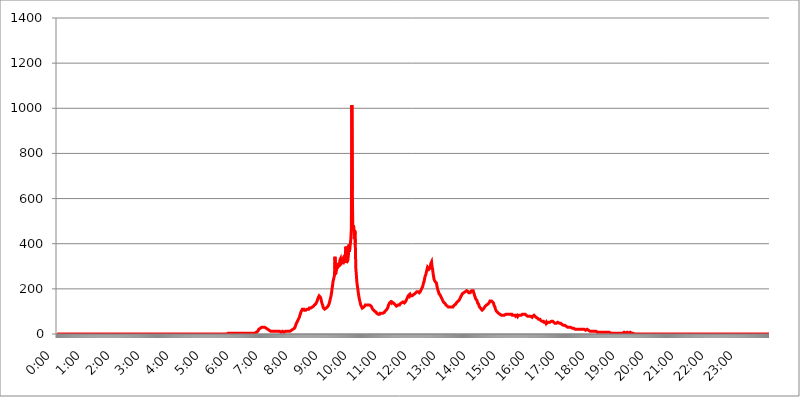
| Category | 2016.05.10. Intenzitás [W/m^2] |
|---|---|
| 0.0 | 0 |
| 0.0006944444444444445 | 0 |
| 0.001388888888888889 | 0 |
| 0.0020833333333333333 | 0 |
| 0.002777777777777778 | 0 |
| 0.003472222222222222 | 0 |
| 0.004166666666666667 | 0 |
| 0.004861111111111111 | 0 |
| 0.005555555555555556 | 0 |
| 0.0062499999999999995 | 0 |
| 0.006944444444444444 | 0 |
| 0.007638888888888889 | 0 |
| 0.008333333333333333 | 0 |
| 0.009027777777777779 | 0 |
| 0.009722222222222222 | 0 |
| 0.010416666666666666 | 0 |
| 0.011111111111111112 | 0 |
| 0.011805555555555555 | 0 |
| 0.012499999999999999 | 0 |
| 0.013194444444444444 | 0 |
| 0.013888888888888888 | 0 |
| 0.014583333333333332 | 0 |
| 0.015277777777777777 | 0 |
| 0.015972222222222224 | 0 |
| 0.016666666666666666 | 0 |
| 0.017361111111111112 | 0 |
| 0.018055555555555557 | 0 |
| 0.01875 | 0 |
| 0.019444444444444445 | 0 |
| 0.02013888888888889 | 0 |
| 0.020833333333333332 | 0 |
| 0.02152777777777778 | 0 |
| 0.022222222222222223 | 0 |
| 0.02291666666666667 | 0 |
| 0.02361111111111111 | 0 |
| 0.024305555555555556 | 0 |
| 0.024999999999999998 | 0 |
| 0.025694444444444447 | 0 |
| 0.02638888888888889 | 0 |
| 0.027083333333333334 | 0 |
| 0.027777777777777776 | 0 |
| 0.02847222222222222 | 0 |
| 0.029166666666666664 | 0 |
| 0.029861111111111113 | 0 |
| 0.030555555555555555 | 0 |
| 0.03125 | 0 |
| 0.03194444444444445 | 0 |
| 0.03263888888888889 | 0 |
| 0.03333333333333333 | 0 |
| 0.034027777777777775 | 0 |
| 0.034722222222222224 | 0 |
| 0.035416666666666666 | 0 |
| 0.036111111111111115 | 0 |
| 0.03680555555555556 | 0 |
| 0.0375 | 0 |
| 0.03819444444444444 | 0 |
| 0.03888888888888889 | 0 |
| 0.03958333333333333 | 0 |
| 0.04027777777777778 | 0 |
| 0.04097222222222222 | 0 |
| 0.041666666666666664 | 0 |
| 0.042361111111111106 | 0 |
| 0.04305555555555556 | 0 |
| 0.043750000000000004 | 0 |
| 0.044444444444444446 | 0 |
| 0.04513888888888889 | 0 |
| 0.04583333333333334 | 0 |
| 0.04652777777777778 | 0 |
| 0.04722222222222222 | 0 |
| 0.04791666666666666 | 0 |
| 0.04861111111111111 | 0 |
| 0.049305555555555554 | 0 |
| 0.049999999999999996 | 0 |
| 0.05069444444444445 | 0 |
| 0.051388888888888894 | 0 |
| 0.052083333333333336 | 0 |
| 0.05277777777777778 | 0 |
| 0.05347222222222222 | 0 |
| 0.05416666666666667 | 0 |
| 0.05486111111111111 | 0 |
| 0.05555555555555555 | 0 |
| 0.05625 | 0 |
| 0.05694444444444444 | 0 |
| 0.057638888888888885 | 0 |
| 0.05833333333333333 | 0 |
| 0.05902777777777778 | 0 |
| 0.059722222222222225 | 0 |
| 0.06041666666666667 | 0 |
| 0.061111111111111116 | 0 |
| 0.06180555555555556 | 0 |
| 0.0625 | 0 |
| 0.06319444444444444 | 0 |
| 0.06388888888888888 | 0 |
| 0.06458333333333334 | 0 |
| 0.06527777777777778 | 0 |
| 0.06597222222222222 | 0 |
| 0.06666666666666667 | 0 |
| 0.06736111111111111 | 0 |
| 0.06805555555555555 | 0 |
| 0.06874999999999999 | 0 |
| 0.06944444444444443 | 0 |
| 0.07013888888888889 | 0 |
| 0.07083333333333333 | 0 |
| 0.07152777777777779 | 0 |
| 0.07222222222222223 | 0 |
| 0.07291666666666667 | 0 |
| 0.07361111111111111 | 0 |
| 0.07430555555555556 | 0 |
| 0.075 | 0 |
| 0.07569444444444444 | 0 |
| 0.0763888888888889 | 0 |
| 0.07708333333333334 | 0 |
| 0.07777777777777778 | 0 |
| 0.07847222222222222 | 0 |
| 0.07916666666666666 | 0 |
| 0.0798611111111111 | 0 |
| 0.08055555555555556 | 0 |
| 0.08125 | 0 |
| 0.08194444444444444 | 0 |
| 0.08263888888888889 | 0 |
| 0.08333333333333333 | 0 |
| 0.08402777777777777 | 0 |
| 0.08472222222222221 | 0 |
| 0.08541666666666665 | 0 |
| 0.08611111111111112 | 0 |
| 0.08680555555555557 | 0 |
| 0.08750000000000001 | 0 |
| 0.08819444444444445 | 0 |
| 0.08888888888888889 | 0 |
| 0.08958333333333333 | 0 |
| 0.09027777777777778 | 0 |
| 0.09097222222222222 | 0 |
| 0.09166666666666667 | 0 |
| 0.09236111111111112 | 0 |
| 0.09305555555555556 | 0 |
| 0.09375 | 0 |
| 0.09444444444444444 | 0 |
| 0.09513888888888888 | 0 |
| 0.09583333333333333 | 0 |
| 0.09652777777777777 | 0 |
| 0.09722222222222222 | 0 |
| 0.09791666666666667 | 0 |
| 0.09861111111111111 | 0 |
| 0.09930555555555555 | 0 |
| 0.09999999999999999 | 0 |
| 0.10069444444444443 | 0 |
| 0.1013888888888889 | 0 |
| 0.10208333333333335 | 0 |
| 0.10277777777777779 | 0 |
| 0.10347222222222223 | 0 |
| 0.10416666666666667 | 0 |
| 0.10486111111111111 | 0 |
| 0.10555555555555556 | 0 |
| 0.10625 | 0 |
| 0.10694444444444444 | 0 |
| 0.1076388888888889 | 0 |
| 0.10833333333333334 | 0 |
| 0.10902777777777778 | 0 |
| 0.10972222222222222 | 0 |
| 0.1111111111111111 | 0 |
| 0.11180555555555556 | 0 |
| 0.11180555555555556 | 0 |
| 0.1125 | 0 |
| 0.11319444444444444 | 0 |
| 0.11388888888888889 | 0 |
| 0.11458333333333333 | 0 |
| 0.11527777777777777 | 0 |
| 0.11597222222222221 | 0 |
| 0.11666666666666665 | 0 |
| 0.1173611111111111 | 0 |
| 0.11805555555555557 | 0 |
| 0.11944444444444445 | 0 |
| 0.12013888888888889 | 0 |
| 0.12083333333333333 | 0 |
| 0.12152777777777778 | 0 |
| 0.12222222222222223 | 0 |
| 0.12291666666666667 | 0 |
| 0.12291666666666667 | 0 |
| 0.12361111111111112 | 0 |
| 0.12430555555555556 | 0 |
| 0.125 | 0 |
| 0.12569444444444444 | 0 |
| 0.12638888888888888 | 0 |
| 0.12708333333333333 | 0 |
| 0.16875 | 0 |
| 0.12847222222222224 | 0 |
| 0.12916666666666668 | 0 |
| 0.12986111111111112 | 0 |
| 0.13055555555555556 | 0 |
| 0.13125 | 0 |
| 0.13194444444444445 | 0 |
| 0.1326388888888889 | 0 |
| 0.13333333333333333 | 0 |
| 0.13402777777777777 | 0 |
| 0.13402777777777777 | 0 |
| 0.13472222222222222 | 0 |
| 0.13541666666666666 | 0 |
| 0.1361111111111111 | 0 |
| 0.13749999999999998 | 0 |
| 0.13819444444444443 | 0 |
| 0.1388888888888889 | 0 |
| 0.13958333333333334 | 0 |
| 0.14027777777777778 | 0 |
| 0.14097222222222222 | 0 |
| 0.14166666666666666 | 0 |
| 0.1423611111111111 | 0 |
| 0.14305555555555557 | 0 |
| 0.14375000000000002 | 0 |
| 0.14444444444444446 | 0 |
| 0.1451388888888889 | 0 |
| 0.1451388888888889 | 0 |
| 0.14652777777777778 | 0 |
| 0.14722222222222223 | 0 |
| 0.14791666666666667 | 0 |
| 0.1486111111111111 | 0 |
| 0.14930555555555555 | 0 |
| 0.15 | 0 |
| 0.15069444444444444 | 0 |
| 0.15138888888888888 | 0 |
| 0.15208333333333332 | 0 |
| 0.15277777777777776 | 0 |
| 0.15347222222222223 | 0 |
| 0.15416666666666667 | 0 |
| 0.15486111111111112 | 0 |
| 0.15555555555555556 | 0 |
| 0.15625 | 0 |
| 0.15694444444444444 | 0 |
| 0.15763888888888888 | 0 |
| 0.15833333333333333 | 0 |
| 0.15902777777777777 | 0 |
| 0.15972222222222224 | 0 |
| 0.16041666666666668 | 0 |
| 0.16111111111111112 | 0 |
| 0.16180555555555556 | 0 |
| 0.1625 | 0 |
| 0.16319444444444445 | 0 |
| 0.1638888888888889 | 0 |
| 0.16458333333333333 | 0 |
| 0.16527777777777777 | 0 |
| 0.16597222222222222 | 0 |
| 0.16666666666666666 | 0 |
| 0.1673611111111111 | 0 |
| 0.16805555555555554 | 0 |
| 0.16874999999999998 | 0 |
| 0.16944444444444443 | 0 |
| 0.17013888888888887 | 0 |
| 0.1708333333333333 | 0 |
| 0.17152777777777775 | 0 |
| 0.17222222222222225 | 0 |
| 0.1729166666666667 | 0 |
| 0.17361111111111113 | 0 |
| 0.17430555555555557 | 0 |
| 0.17500000000000002 | 0 |
| 0.17569444444444446 | 0 |
| 0.1763888888888889 | 0 |
| 0.17708333333333334 | 0 |
| 0.17777777777777778 | 0 |
| 0.17847222222222223 | 0 |
| 0.17916666666666667 | 0 |
| 0.1798611111111111 | 0 |
| 0.18055555555555555 | 0 |
| 0.18125 | 0 |
| 0.18194444444444444 | 0 |
| 0.1826388888888889 | 0 |
| 0.18333333333333335 | 0 |
| 0.1840277777777778 | 0 |
| 0.18472222222222223 | 0 |
| 0.18541666666666667 | 0 |
| 0.18611111111111112 | 0 |
| 0.18680555555555556 | 0 |
| 0.1875 | 0 |
| 0.18819444444444444 | 0 |
| 0.18888888888888888 | 0 |
| 0.18958333333333333 | 0 |
| 0.19027777777777777 | 0 |
| 0.1909722222222222 | 0 |
| 0.19166666666666665 | 0 |
| 0.19236111111111112 | 0 |
| 0.19305555555555554 | 0 |
| 0.19375 | 0 |
| 0.19444444444444445 | 0 |
| 0.1951388888888889 | 0 |
| 0.19583333333333333 | 0 |
| 0.19652777777777777 | 0 |
| 0.19722222222222222 | 0 |
| 0.19791666666666666 | 0 |
| 0.1986111111111111 | 0 |
| 0.19930555555555554 | 0 |
| 0.19999999999999998 | 0 |
| 0.20069444444444443 | 0 |
| 0.20138888888888887 | 0 |
| 0.2020833333333333 | 0 |
| 0.2027777777777778 | 0 |
| 0.2034722222222222 | 0 |
| 0.2041666666666667 | 0 |
| 0.20486111111111113 | 0 |
| 0.20555555555555557 | 0 |
| 0.20625000000000002 | 0 |
| 0.20694444444444446 | 0 |
| 0.2076388888888889 | 0 |
| 0.20833333333333334 | 0 |
| 0.20902777777777778 | 0 |
| 0.20972222222222223 | 0 |
| 0.21041666666666667 | 0 |
| 0.2111111111111111 | 0 |
| 0.21180555555555555 | 0 |
| 0.2125 | 0 |
| 0.21319444444444444 | 0 |
| 0.2138888888888889 | 0 |
| 0.21458333333333335 | 0 |
| 0.2152777777777778 | 0 |
| 0.21597222222222223 | 0 |
| 0.21666666666666667 | 0 |
| 0.21736111111111112 | 0 |
| 0.21805555555555556 | 0 |
| 0.21875 | 0 |
| 0.21944444444444444 | 0 |
| 0.22013888888888888 | 0 |
| 0.22083333333333333 | 0 |
| 0.22152777777777777 | 0 |
| 0.2222222222222222 | 0 |
| 0.22291666666666665 | 0 |
| 0.2236111111111111 | 0 |
| 0.22430555555555556 | 0 |
| 0.225 | 0 |
| 0.22569444444444445 | 0 |
| 0.2263888888888889 | 0 |
| 0.22708333333333333 | 0 |
| 0.22777777777777777 | 0 |
| 0.22847222222222222 | 0 |
| 0.22916666666666666 | 0 |
| 0.2298611111111111 | 0 |
| 0.23055555555555554 | 0 |
| 0.23124999999999998 | 0 |
| 0.23194444444444443 | 0 |
| 0.23263888888888887 | 0 |
| 0.2333333333333333 | 0 |
| 0.2340277777777778 | 0 |
| 0.2347222222222222 | 0 |
| 0.2354166666666667 | 0 |
| 0.23611111111111113 | 0 |
| 0.23680555555555557 | 0 |
| 0.23750000000000002 | 0 |
| 0.23819444444444446 | 0 |
| 0.2388888888888889 | 0 |
| 0.23958333333333334 | 3.525 |
| 0.24027777777777778 | 3.525 |
| 0.24097222222222223 | 3.525 |
| 0.24166666666666667 | 3.525 |
| 0.2423611111111111 | 3.525 |
| 0.24305555555555555 | 3.525 |
| 0.24375 | 3.525 |
| 0.24444444444444446 | 3.525 |
| 0.24513888888888888 | 3.525 |
| 0.24583333333333335 | 3.525 |
| 0.2465277777777778 | 3.525 |
| 0.24722222222222223 | 3.525 |
| 0.24791666666666667 | 3.525 |
| 0.24861111111111112 | 3.525 |
| 0.24930555555555556 | 3.525 |
| 0.25 | 3.525 |
| 0.25069444444444444 | 3.525 |
| 0.2513888888888889 | 3.525 |
| 0.2520833333333333 | 3.525 |
| 0.25277777777777777 | 3.525 |
| 0.2534722222222222 | 3.525 |
| 0.25416666666666665 | 3.525 |
| 0.2548611111111111 | 3.525 |
| 0.2555555555555556 | 3.525 |
| 0.25625000000000003 | 3.525 |
| 0.2569444444444445 | 3.525 |
| 0.2576388888888889 | 3.525 |
| 0.25833333333333336 | 3.525 |
| 0.2590277777777778 | 3.525 |
| 0.25972222222222224 | 3.525 |
| 0.2604166666666667 | 3.525 |
| 0.2611111111111111 | 3.525 |
| 0.26180555555555557 | 3.525 |
| 0.2625 | 3.525 |
| 0.26319444444444445 | 3.525 |
| 0.2638888888888889 | 3.525 |
| 0.26458333333333334 | 3.525 |
| 0.2652777777777778 | 3.525 |
| 0.2659722222222222 | 3.525 |
| 0.26666666666666666 | 3.525 |
| 0.2673611111111111 | 3.525 |
| 0.26805555555555555 | 3.525 |
| 0.26875 | 3.525 |
| 0.26944444444444443 | 3.525 |
| 0.2701388888888889 | 3.525 |
| 0.2708333333333333 | 3.525 |
| 0.27152777777777776 | 3.525 |
| 0.2722222222222222 | 3.525 |
| 0.27291666666666664 | 3.525 |
| 0.2736111111111111 | 3.525 |
| 0.2743055555555555 | 3.525 |
| 0.27499999999999997 | 3.525 |
| 0.27569444444444446 | 3.525 |
| 0.27638888888888885 | 3.525 |
| 0.27708333333333335 | 3.525 |
| 0.2777777777777778 | 7.887 |
| 0.27847222222222223 | 7.887 |
| 0.2791666666666667 | 7.887 |
| 0.2798611111111111 | 12.257 |
| 0.28055555555555556 | 12.257 |
| 0.28125 | 12.257 |
| 0.28194444444444444 | 16.636 |
| 0.2826388888888889 | 21.024 |
| 0.2833333333333333 | 21.024 |
| 0.28402777777777777 | 25.419 |
| 0.2847222222222222 | 25.419 |
| 0.28541666666666665 | 29.823 |
| 0.28611111111111115 | 29.823 |
| 0.28680555555555554 | 29.823 |
| 0.28750000000000003 | 34.234 |
| 0.2881944444444445 | 34.234 |
| 0.2888888888888889 | 29.823 |
| 0.28958333333333336 | 29.823 |
| 0.2902777777777778 | 29.823 |
| 0.29097222222222224 | 29.823 |
| 0.2916666666666667 | 25.419 |
| 0.2923611111111111 | 25.419 |
| 0.29305555555555557 | 25.419 |
| 0.29375 | 21.024 |
| 0.29444444444444445 | 21.024 |
| 0.2951388888888889 | 21.024 |
| 0.29583333333333334 | 21.024 |
| 0.2965277777777778 | 16.636 |
| 0.2972222222222222 | 16.636 |
| 0.29791666666666666 | 16.636 |
| 0.2986111111111111 | 16.636 |
| 0.29930555555555555 | 12.257 |
| 0.3 | 12.257 |
| 0.30069444444444443 | 12.257 |
| 0.3013888888888889 | 12.257 |
| 0.3020833333333333 | 12.257 |
| 0.30277777777777776 | 12.257 |
| 0.3034722222222222 | 12.257 |
| 0.30416666666666664 | 12.257 |
| 0.3048611111111111 | 12.257 |
| 0.3055555555555555 | 12.257 |
| 0.30624999999999997 | 12.257 |
| 0.3069444444444444 | 12.257 |
| 0.3076388888888889 | 12.257 |
| 0.30833333333333335 | 12.257 |
| 0.3090277777777778 | 12.257 |
| 0.30972222222222223 | 12.257 |
| 0.3104166666666667 | 12.257 |
| 0.3111111111111111 | 12.257 |
| 0.31180555555555556 | 12.257 |
| 0.3125 | 7.887 |
| 0.31319444444444444 | 7.887 |
| 0.3138888888888889 | 7.887 |
| 0.3145833333333333 | 12.257 |
| 0.31527777777777777 | 12.257 |
| 0.3159722222222222 | 12.257 |
| 0.31666666666666665 | 7.887 |
| 0.31736111111111115 | 7.887 |
| 0.31805555555555554 | 7.887 |
| 0.31875000000000003 | 12.257 |
| 0.3194444444444445 | 12.257 |
| 0.3201388888888889 | 12.257 |
| 0.32083333333333336 | 12.257 |
| 0.3215277777777778 | 12.257 |
| 0.32222222222222224 | 12.257 |
| 0.3229166666666667 | 12.257 |
| 0.3236111111111111 | 12.257 |
| 0.32430555555555557 | 12.257 |
| 0.325 | 12.257 |
| 0.32569444444444445 | 12.257 |
| 0.3263888888888889 | 12.257 |
| 0.32708333333333334 | 16.636 |
| 0.3277777777777778 | 16.636 |
| 0.3284722222222222 | 16.636 |
| 0.32916666666666666 | 16.636 |
| 0.3298611111111111 | 21.024 |
| 0.33055555555555555 | 21.024 |
| 0.33125 | 21.024 |
| 0.33194444444444443 | 25.419 |
| 0.3326388888888889 | 25.419 |
| 0.3333333333333333 | 29.823 |
| 0.3340277777777778 | 34.234 |
| 0.3347222222222222 | 38.653 |
| 0.3354166666666667 | 47.511 |
| 0.3361111111111111 | 51.951 |
| 0.3368055555555556 | 56.398 |
| 0.33749999999999997 | 60.85 |
| 0.33819444444444446 | 65.31 |
| 0.33888888888888885 | 69.775 |
| 0.33958333333333335 | 74.246 |
| 0.34027777777777773 | 83.205 |
| 0.34097222222222223 | 87.692 |
| 0.3416666666666666 | 96.682 |
| 0.3423611111111111 | 101.184 |
| 0.3430555555555555 | 105.69 |
| 0.34375 | 110.201 |
| 0.3444444444444445 | 110.201 |
| 0.3451388888888889 | 110.201 |
| 0.3458333333333334 | 110.201 |
| 0.34652777777777777 | 105.69 |
| 0.34722222222222227 | 105.69 |
| 0.34791666666666665 | 105.69 |
| 0.34861111111111115 | 105.69 |
| 0.34930555555555554 | 105.69 |
| 0.35000000000000003 | 105.69 |
| 0.3506944444444444 | 110.201 |
| 0.3513888888888889 | 110.201 |
| 0.3520833333333333 | 110.201 |
| 0.3527777777777778 | 110.201 |
| 0.3534722222222222 | 114.716 |
| 0.3541666666666667 | 114.716 |
| 0.3548611111111111 | 114.716 |
| 0.35555555555555557 | 114.716 |
| 0.35625 | 114.716 |
| 0.35694444444444445 | 114.716 |
| 0.3576388888888889 | 119.235 |
| 0.35833333333333334 | 119.235 |
| 0.3590277777777778 | 119.235 |
| 0.3597222222222222 | 123.758 |
| 0.36041666666666666 | 128.284 |
| 0.3611111111111111 | 128.284 |
| 0.36180555555555555 | 128.284 |
| 0.3625 | 132.814 |
| 0.36319444444444443 | 137.347 |
| 0.3638888888888889 | 141.884 |
| 0.3645833333333333 | 146.423 |
| 0.3652777777777778 | 155.509 |
| 0.3659722222222222 | 160.056 |
| 0.3666666666666667 | 164.605 |
| 0.3673611111111111 | 169.156 |
| 0.3680555555555556 | 169.156 |
| 0.36874999999999997 | 164.605 |
| 0.36944444444444446 | 160.056 |
| 0.37013888888888885 | 150.964 |
| 0.37083333333333335 | 141.884 |
| 0.37152777777777773 | 132.814 |
| 0.37222222222222223 | 128.284 |
| 0.3729166666666666 | 119.235 |
| 0.3736111111111111 | 114.716 |
| 0.3743055555555555 | 114.716 |
| 0.375 | 110.201 |
| 0.3756944444444445 | 110.201 |
| 0.3763888888888889 | 110.201 |
| 0.3770833333333334 | 114.716 |
| 0.37777777777777777 | 114.716 |
| 0.37847222222222227 | 119.235 |
| 0.37916666666666665 | 119.235 |
| 0.37986111111111115 | 123.758 |
| 0.38055555555555554 | 128.284 |
| 0.38125000000000003 | 132.814 |
| 0.3819444444444444 | 141.884 |
| 0.3826388888888889 | 150.964 |
| 0.3833333333333333 | 160.056 |
| 0.3840277777777778 | 169.156 |
| 0.3847222222222222 | 182.82 |
| 0.3854166666666667 | 201.058 |
| 0.3861111111111111 | 214.746 |
| 0.38680555555555557 | 233 |
| 0.3875 | 242.127 |
| 0.38819444444444445 | 251.251 |
| 0.3888888888888889 | 260.373 |
| 0.38958333333333334 | 342.162 |
| 0.3902777777777778 | 264.932 |
| 0.3909722222222222 | 274.047 |
| 0.39166666666666666 | 283.156 |
| 0.3923611111111111 | 305.898 |
| 0.39305555555555555 | 296.808 |
| 0.39375 | 301.354 |
| 0.39444444444444443 | 314.98 |
| 0.3951388888888889 | 305.898 |
| 0.3958333333333333 | 310.44 |
| 0.3965277777777778 | 328.584 |
| 0.3972222222222222 | 333.113 |
| 0.3979166666666667 | 310.44 |
| 0.3986111111111111 | 310.44 |
| 0.3993055555555556 | 314.98 |
| 0.39999999999999997 | 328.584 |
| 0.40069444444444446 | 333.113 |
| 0.40138888888888885 | 324.052 |
| 0.40208333333333335 | 319.517 |
| 0.40277777777777773 | 324.052 |
| 0.40347222222222223 | 337.639 |
| 0.4041666666666666 | 355.712 |
| 0.4048611111111111 | 387.202 |
| 0.4055555555555555 | 314.98 |
| 0.40625 | 314.98 |
| 0.4069444444444445 | 314.98 |
| 0.4076388888888889 | 328.584 |
| 0.4083333333333334 | 351.198 |
| 0.40902777777777777 | 396.164 |
| 0.40972222222222227 | 364.728 |
| 0.41041666666666665 | 382.715 |
| 0.41111111111111115 | 400.638 |
| 0.41180555555555554 | 422.943 |
| 0.41250000000000003 | 467.187 |
| 0.4131944444444444 | 1014.852 |
| 0.4138888888888889 | 634.105 |
| 0.4145833333333333 | 458.38 |
| 0.4152777777777778 | 480.356 |
| 0.4159722222222222 | 471.582 |
| 0.4166666666666667 | 422.943 |
| 0.4173611111111111 | 458.38 |
| 0.41805555555555557 | 396.164 |
| 0.41875 | 292.259 |
| 0.41944444444444445 | 264.932 |
| 0.4201388888888889 | 233 |
| 0.42083333333333334 | 214.746 |
| 0.4215277777777778 | 201.058 |
| 0.4222222222222222 | 182.82 |
| 0.42291666666666666 | 169.156 |
| 0.4236111111111111 | 155.509 |
| 0.42430555555555555 | 146.423 |
| 0.425 | 137.347 |
| 0.42569444444444443 | 128.284 |
| 0.4263888888888889 | 123.758 |
| 0.4270833333333333 | 119.235 |
| 0.4277777777777778 | 114.716 |
| 0.4284722222222222 | 114.716 |
| 0.4291666666666667 | 114.716 |
| 0.4298611111111111 | 119.235 |
| 0.4305555555555556 | 119.235 |
| 0.43124999999999997 | 123.758 |
| 0.43194444444444446 | 128.284 |
| 0.43263888888888885 | 128.284 |
| 0.43333333333333335 | 128.284 |
| 0.43402777777777773 | 128.284 |
| 0.43472222222222223 | 128.284 |
| 0.4354166666666666 | 128.284 |
| 0.4361111111111111 | 128.284 |
| 0.4368055555555555 | 128.284 |
| 0.4375 | 128.284 |
| 0.4381944444444445 | 128.284 |
| 0.4388888888888889 | 128.284 |
| 0.4395833333333334 | 128.284 |
| 0.44027777777777777 | 123.758 |
| 0.44097222222222227 | 119.235 |
| 0.44166666666666665 | 114.716 |
| 0.44236111111111115 | 110.201 |
| 0.44305555555555554 | 110.201 |
| 0.44375000000000003 | 105.69 |
| 0.4444444444444444 | 105.69 |
| 0.4451388888888889 | 101.184 |
| 0.4458333333333333 | 101.184 |
| 0.4465277777777778 | 101.184 |
| 0.4472222222222222 | 96.682 |
| 0.4479166666666667 | 92.184 |
| 0.4486111111111111 | 92.184 |
| 0.44930555555555557 | 92.184 |
| 0.45 | 87.692 |
| 0.45069444444444445 | 87.692 |
| 0.4513888888888889 | 87.692 |
| 0.45208333333333334 | 87.692 |
| 0.4527777777777778 | 92.184 |
| 0.4534722222222222 | 92.184 |
| 0.45416666666666666 | 92.184 |
| 0.4548611111111111 | 92.184 |
| 0.45555555555555555 | 92.184 |
| 0.45625 | 92.184 |
| 0.45694444444444443 | 92.184 |
| 0.4576388888888889 | 92.184 |
| 0.4583333333333333 | 92.184 |
| 0.4590277777777778 | 96.682 |
| 0.4597222222222222 | 101.184 |
| 0.4604166666666667 | 101.184 |
| 0.4611111111111111 | 105.69 |
| 0.4618055555555556 | 105.69 |
| 0.46249999999999997 | 110.201 |
| 0.46319444444444446 | 114.716 |
| 0.46388888888888885 | 119.235 |
| 0.46458333333333335 | 128.284 |
| 0.46527777777777773 | 132.814 |
| 0.46597222222222223 | 137.347 |
| 0.4666666666666666 | 137.347 |
| 0.4673611111111111 | 141.884 |
| 0.4680555555555555 | 141.884 |
| 0.46875 | 137.347 |
| 0.4694444444444445 | 141.884 |
| 0.4701388888888889 | 141.884 |
| 0.4708333333333334 | 141.884 |
| 0.47152777777777777 | 137.347 |
| 0.47222222222222227 | 137.347 |
| 0.47291666666666665 | 132.814 |
| 0.47361111111111115 | 132.814 |
| 0.47430555555555554 | 128.284 |
| 0.47500000000000003 | 128.284 |
| 0.4756944444444444 | 123.758 |
| 0.4763888888888889 | 123.758 |
| 0.4770833333333333 | 123.758 |
| 0.4777777777777778 | 128.284 |
| 0.4784722222222222 | 128.284 |
| 0.4791666666666667 | 128.284 |
| 0.4798611111111111 | 128.284 |
| 0.48055555555555557 | 132.814 |
| 0.48125 | 132.814 |
| 0.48194444444444445 | 132.814 |
| 0.4826388888888889 | 137.347 |
| 0.48333333333333334 | 137.347 |
| 0.4840277777777778 | 137.347 |
| 0.4847222222222222 | 141.884 |
| 0.48541666666666666 | 141.884 |
| 0.4861111111111111 | 141.884 |
| 0.48680555555555555 | 137.347 |
| 0.4875 | 137.347 |
| 0.48819444444444443 | 141.884 |
| 0.4888888888888889 | 146.423 |
| 0.4895833333333333 | 150.964 |
| 0.4902777777777778 | 155.509 |
| 0.4909722222222222 | 160.056 |
| 0.4916666666666667 | 164.605 |
| 0.4923611111111111 | 169.156 |
| 0.4930555555555556 | 169.156 |
| 0.49374999999999997 | 173.709 |
| 0.49444444444444446 | 169.156 |
| 0.49513888888888885 | 173.709 |
| 0.49583333333333335 | 169.156 |
| 0.49652777777777773 | 169.156 |
| 0.49722222222222223 | 169.156 |
| 0.4979166666666666 | 169.156 |
| 0.4986111111111111 | 169.156 |
| 0.4993055555555555 | 173.709 |
| 0.5 | 173.709 |
| 0.5006944444444444 | 173.709 |
| 0.5013888888888889 | 178.264 |
| 0.5020833333333333 | 178.264 |
| 0.5027777777777778 | 182.82 |
| 0.5034722222222222 | 182.82 |
| 0.5041666666666667 | 187.378 |
| 0.5048611111111111 | 187.378 |
| 0.5055555555555555 | 187.378 |
| 0.50625 | 187.378 |
| 0.5069444444444444 | 187.378 |
| 0.5076388888888889 | 182.82 |
| 0.5083333333333333 | 182.82 |
| 0.5090277777777777 | 187.378 |
| 0.5097222222222222 | 191.937 |
| 0.5104166666666666 | 196.497 |
| 0.5111111111111112 | 201.058 |
| 0.5118055555555555 | 205.62 |
| 0.5125000000000001 | 210.182 |
| 0.5131944444444444 | 219.309 |
| 0.513888888888889 | 228.436 |
| 0.5145833333333333 | 233 |
| 0.5152777777777778 | 246.689 |
| 0.5159722222222222 | 255.813 |
| 0.5166666666666667 | 260.373 |
| 0.517361111111111 | 269.49 |
| 0.5180555555555556 | 278.603 |
| 0.5187499999999999 | 287.709 |
| 0.5194444444444445 | 296.808 |
| 0.5201388888888888 | 296.808 |
| 0.5208333333333334 | 292.259 |
| 0.5215277777777778 | 287.709 |
| 0.5222222222222223 | 287.709 |
| 0.5229166666666667 | 292.259 |
| 0.5236111111111111 | 305.898 |
| 0.5243055555555556 | 314.98 |
| 0.525 | 319.517 |
| 0.5256944444444445 | 296.808 |
| 0.5263888888888889 | 287.709 |
| 0.5270833333333333 | 269.49 |
| 0.5277777777777778 | 255.813 |
| 0.5284722222222222 | 242.127 |
| 0.5291666666666667 | 237.564 |
| 0.5298611111111111 | 233 |
| 0.5305555555555556 | 233 |
| 0.53125 | 228.436 |
| 0.5319444444444444 | 223.873 |
| 0.5326388888888889 | 210.182 |
| 0.5333333333333333 | 201.058 |
| 0.5340277777777778 | 191.937 |
| 0.5347222222222222 | 187.378 |
| 0.5354166666666667 | 178.264 |
| 0.5361111111111111 | 178.264 |
| 0.5368055555555555 | 173.709 |
| 0.5375 | 169.156 |
| 0.5381944444444444 | 164.605 |
| 0.5388888888888889 | 160.056 |
| 0.5395833333333333 | 155.509 |
| 0.5402777777777777 | 150.964 |
| 0.5409722222222222 | 146.423 |
| 0.5416666666666666 | 141.884 |
| 0.5423611111111112 | 141.884 |
| 0.5430555555555555 | 137.347 |
| 0.5437500000000001 | 137.347 |
| 0.5444444444444444 | 132.814 |
| 0.545138888888889 | 128.284 |
| 0.5458333333333333 | 128.284 |
| 0.5465277777777778 | 128.284 |
| 0.5472222222222222 | 123.758 |
| 0.5479166666666667 | 123.758 |
| 0.548611111111111 | 119.235 |
| 0.5493055555555556 | 119.235 |
| 0.5499999999999999 | 119.235 |
| 0.5506944444444445 | 119.235 |
| 0.5513888888888888 | 119.235 |
| 0.5520833333333334 | 119.235 |
| 0.5527777777777778 | 119.235 |
| 0.5534722222222223 | 119.235 |
| 0.5541666666666667 | 119.235 |
| 0.5548611111111111 | 119.235 |
| 0.5555555555555556 | 123.758 |
| 0.55625 | 123.758 |
| 0.5569444444444445 | 128.284 |
| 0.5576388888888889 | 128.284 |
| 0.5583333333333333 | 128.284 |
| 0.5590277777777778 | 132.814 |
| 0.5597222222222222 | 137.347 |
| 0.5604166666666667 | 137.347 |
| 0.5611111111111111 | 141.884 |
| 0.5618055555555556 | 141.884 |
| 0.5625 | 146.423 |
| 0.5631944444444444 | 146.423 |
| 0.5638888888888889 | 150.964 |
| 0.5645833333333333 | 155.509 |
| 0.5652777777777778 | 160.056 |
| 0.5659722222222222 | 164.605 |
| 0.5666666666666667 | 169.156 |
| 0.5673611111111111 | 173.709 |
| 0.5680555555555555 | 178.264 |
| 0.56875 | 178.264 |
| 0.5694444444444444 | 178.264 |
| 0.5701388888888889 | 182.82 |
| 0.5708333333333333 | 182.82 |
| 0.5715277777777777 | 182.82 |
| 0.5722222222222222 | 187.378 |
| 0.5729166666666666 | 187.378 |
| 0.5736111111111112 | 187.378 |
| 0.5743055555555555 | 191.937 |
| 0.5750000000000001 | 191.937 |
| 0.5756944444444444 | 191.937 |
| 0.576388888888889 | 187.378 |
| 0.5770833333333333 | 182.82 |
| 0.5777777777777778 | 182.82 |
| 0.5784722222222222 | 182.82 |
| 0.5791666666666667 | 182.82 |
| 0.579861111111111 | 187.378 |
| 0.5805555555555556 | 187.378 |
| 0.5812499999999999 | 191.937 |
| 0.5819444444444445 | 191.937 |
| 0.5826388888888888 | 191.937 |
| 0.5833333333333334 | 191.937 |
| 0.5840277777777778 | 182.82 |
| 0.5847222222222223 | 178.264 |
| 0.5854166666666667 | 169.156 |
| 0.5861111111111111 | 164.605 |
| 0.5868055555555556 | 155.509 |
| 0.5875 | 155.509 |
| 0.5881944444444445 | 150.964 |
| 0.5888888888888889 | 146.423 |
| 0.5895833333333333 | 137.347 |
| 0.5902777777777778 | 137.347 |
| 0.5909722222222222 | 132.814 |
| 0.5916666666666667 | 123.758 |
| 0.5923611111111111 | 119.235 |
| 0.5930555555555556 | 119.235 |
| 0.59375 | 114.716 |
| 0.5944444444444444 | 110.201 |
| 0.5951388888888889 | 110.201 |
| 0.5958333333333333 | 105.69 |
| 0.5965277777777778 | 105.69 |
| 0.5972222222222222 | 110.201 |
| 0.5979166666666667 | 110.201 |
| 0.5986111111111111 | 114.716 |
| 0.5993055555555555 | 119.235 |
| 0.6 | 119.235 |
| 0.6006944444444444 | 123.758 |
| 0.6013888888888889 | 123.758 |
| 0.6020833333333333 | 128.284 |
| 0.6027777777777777 | 128.284 |
| 0.6034722222222222 | 128.284 |
| 0.6041666666666666 | 132.814 |
| 0.6048611111111112 | 132.814 |
| 0.6055555555555555 | 137.347 |
| 0.6062500000000001 | 141.884 |
| 0.6069444444444444 | 146.423 |
| 0.607638888888889 | 146.423 |
| 0.6083333333333333 | 146.423 |
| 0.6090277777777778 | 146.423 |
| 0.6097222222222222 | 146.423 |
| 0.6104166666666667 | 141.884 |
| 0.611111111111111 | 141.884 |
| 0.6118055555555556 | 137.347 |
| 0.6124999999999999 | 128.284 |
| 0.6131944444444445 | 123.758 |
| 0.6138888888888888 | 119.235 |
| 0.6145833333333334 | 110.201 |
| 0.6152777777777778 | 105.69 |
| 0.6159722222222223 | 101.184 |
| 0.6166666666666667 | 101.184 |
| 0.6173611111111111 | 96.682 |
| 0.6180555555555556 | 96.682 |
| 0.61875 | 92.184 |
| 0.6194444444444445 | 92.184 |
| 0.6201388888888889 | 92.184 |
| 0.6208333333333333 | 87.692 |
| 0.6215277777777778 | 87.692 |
| 0.6222222222222222 | 87.692 |
| 0.6229166666666667 | 83.205 |
| 0.6236111111111111 | 83.205 |
| 0.6243055555555556 | 83.205 |
| 0.625 | 83.205 |
| 0.6256944444444444 | 83.205 |
| 0.6263888888888889 | 83.205 |
| 0.6270833333333333 | 83.205 |
| 0.6277777777777778 | 83.205 |
| 0.6284722222222222 | 83.205 |
| 0.6291666666666667 | 87.692 |
| 0.6298611111111111 | 87.692 |
| 0.6305555555555555 | 87.692 |
| 0.63125 | 87.692 |
| 0.6319444444444444 | 87.692 |
| 0.6326388888888889 | 87.692 |
| 0.6333333333333333 | 87.692 |
| 0.6340277777777777 | 87.692 |
| 0.6347222222222222 | 87.692 |
| 0.6354166666666666 | 87.692 |
| 0.6361111111111112 | 87.692 |
| 0.6368055555555555 | 87.692 |
| 0.6375000000000001 | 87.692 |
| 0.6381944444444444 | 83.205 |
| 0.638888888888889 | 83.205 |
| 0.6395833333333333 | 83.205 |
| 0.6402777777777778 | 83.205 |
| 0.6409722222222222 | 83.205 |
| 0.6416666666666667 | 83.205 |
| 0.642361111111111 | 83.205 |
| 0.6430555555555556 | 78.722 |
| 0.6437499999999999 | 78.722 |
| 0.6444444444444445 | 78.722 |
| 0.6451388888888888 | 83.205 |
| 0.6458333333333334 | 78.722 |
| 0.6465277777777778 | 83.205 |
| 0.6472222222222223 | 83.205 |
| 0.6479166666666667 | 83.205 |
| 0.6486111111111111 | 83.205 |
| 0.6493055555555556 | 83.205 |
| 0.65 | 83.205 |
| 0.6506944444444445 | 83.205 |
| 0.6513888888888889 | 83.205 |
| 0.6520833333333333 | 87.692 |
| 0.6527777777777778 | 87.692 |
| 0.6534722222222222 | 87.692 |
| 0.6541666666666667 | 87.692 |
| 0.6548611111111111 | 87.692 |
| 0.6555555555555556 | 87.692 |
| 0.65625 | 87.692 |
| 0.6569444444444444 | 87.692 |
| 0.6576388888888889 | 83.205 |
| 0.6583333333333333 | 83.205 |
| 0.6590277777777778 | 83.205 |
| 0.6597222222222222 | 78.722 |
| 0.6604166666666667 | 78.722 |
| 0.6611111111111111 | 78.722 |
| 0.6618055555555555 | 78.722 |
| 0.6625 | 78.722 |
| 0.6631944444444444 | 78.722 |
| 0.6638888888888889 | 78.722 |
| 0.6645833333333333 | 78.722 |
| 0.6652777777777777 | 78.722 |
| 0.6659722222222222 | 74.246 |
| 0.6666666666666666 | 78.722 |
| 0.6673611111111111 | 78.722 |
| 0.6680555555555556 | 78.722 |
| 0.6687500000000001 | 83.205 |
| 0.6694444444444444 | 83.205 |
| 0.6701388888888888 | 78.722 |
| 0.6708333333333334 | 78.722 |
| 0.6715277777777778 | 74.246 |
| 0.6722222222222222 | 74.246 |
| 0.6729166666666666 | 74.246 |
| 0.6736111111111112 | 69.775 |
| 0.6743055555555556 | 69.775 |
| 0.6749999999999999 | 65.31 |
| 0.6756944444444444 | 65.31 |
| 0.6763888888888889 | 65.31 |
| 0.6770833333333334 | 65.31 |
| 0.6777777777777777 | 60.85 |
| 0.6784722222222223 | 60.85 |
| 0.6791666666666667 | 60.85 |
| 0.6798611111111111 | 56.398 |
| 0.6805555555555555 | 56.398 |
| 0.68125 | 56.398 |
| 0.6819444444444445 | 56.398 |
| 0.6826388888888889 | 51.951 |
| 0.6833333333333332 | 51.951 |
| 0.6840277777777778 | 51.951 |
| 0.6847222222222222 | 51.951 |
| 0.6854166666666667 | 47.511 |
| 0.686111111111111 | 51.951 |
| 0.6868055555555556 | 47.511 |
| 0.6875 | 47.511 |
| 0.6881944444444444 | 47.511 |
| 0.688888888888889 | 51.951 |
| 0.6895833333333333 | 51.951 |
| 0.6902777777777778 | 51.951 |
| 0.6909722222222222 | 51.951 |
| 0.6916666666666668 | 51.951 |
| 0.6923611111111111 | 51.951 |
| 0.6930555555555555 | 56.398 |
| 0.69375 | 56.398 |
| 0.6944444444444445 | 56.398 |
| 0.6951388888888889 | 56.398 |
| 0.6958333333333333 | 56.398 |
| 0.6965277777777777 | 51.951 |
| 0.6972222222222223 | 51.951 |
| 0.6979166666666666 | 47.511 |
| 0.6986111111111111 | 47.511 |
| 0.6993055555555556 | 47.511 |
| 0.7000000000000001 | 47.511 |
| 0.7006944444444444 | 47.511 |
| 0.7013888888888888 | 47.511 |
| 0.7020833333333334 | 51.951 |
| 0.7027777777777778 | 51.951 |
| 0.7034722222222222 | 51.951 |
| 0.7041666666666666 | 47.511 |
| 0.7048611111111112 | 47.511 |
| 0.7055555555555556 | 47.511 |
| 0.7062499999999999 | 47.511 |
| 0.7069444444444444 | 47.511 |
| 0.7076388888888889 | 43.079 |
| 0.7083333333333334 | 43.079 |
| 0.7090277777777777 | 38.653 |
| 0.7097222222222223 | 38.653 |
| 0.7104166666666667 | 38.653 |
| 0.7111111111111111 | 38.653 |
| 0.7118055555555555 | 38.653 |
| 0.7125 | 38.653 |
| 0.7131944444444445 | 38.653 |
| 0.7138888888888889 | 34.234 |
| 0.7145833333333332 | 34.234 |
| 0.7152777777777778 | 29.823 |
| 0.7159722222222222 | 29.823 |
| 0.7166666666666667 | 29.823 |
| 0.717361111111111 | 29.823 |
| 0.7180555555555556 | 29.823 |
| 0.71875 | 29.823 |
| 0.7194444444444444 | 29.823 |
| 0.720138888888889 | 29.823 |
| 0.7208333333333333 | 29.823 |
| 0.7215277777777778 | 25.419 |
| 0.7222222222222222 | 25.419 |
| 0.7229166666666668 | 25.419 |
| 0.7236111111111111 | 25.419 |
| 0.7243055555555555 | 25.419 |
| 0.725 | 21.024 |
| 0.7256944444444445 | 25.419 |
| 0.7263888888888889 | 21.024 |
| 0.7270833333333333 | 21.024 |
| 0.7277777777777777 | 21.024 |
| 0.7284722222222223 | 21.024 |
| 0.7291666666666666 | 21.024 |
| 0.7298611111111111 | 21.024 |
| 0.7305555555555556 | 21.024 |
| 0.7312500000000001 | 21.024 |
| 0.7319444444444444 | 21.024 |
| 0.7326388888888888 | 21.024 |
| 0.7333333333333334 | 16.636 |
| 0.7340277777777778 | 21.024 |
| 0.7347222222222222 | 21.024 |
| 0.7354166666666666 | 21.024 |
| 0.7361111111111112 | 21.024 |
| 0.7368055555555556 | 21.024 |
| 0.7374999999999999 | 21.024 |
| 0.7381944444444444 | 21.024 |
| 0.7388888888888889 | 21.024 |
| 0.7395833333333334 | 16.636 |
| 0.7402777777777777 | 16.636 |
| 0.7409722222222223 | 16.636 |
| 0.7416666666666667 | 21.024 |
| 0.7423611111111111 | 21.024 |
| 0.7430555555555555 | 21.024 |
| 0.74375 | 21.024 |
| 0.7444444444444445 | 16.636 |
| 0.7451388888888889 | 16.636 |
| 0.7458333333333332 | 16.636 |
| 0.7465277777777778 | 16.636 |
| 0.7472222222222222 | 12.257 |
| 0.7479166666666667 | 12.257 |
| 0.748611111111111 | 12.257 |
| 0.7493055555555556 | 12.257 |
| 0.75 | 12.257 |
| 0.7506944444444444 | 12.257 |
| 0.751388888888889 | 12.257 |
| 0.7520833333333333 | 12.257 |
| 0.7527777777777778 | 12.257 |
| 0.7534722222222222 | 12.257 |
| 0.7541666666666668 | 12.257 |
| 0.7548611111111111 | 12.257 |
| 0.7555555555555555 | 12.257 |
| 0.75625 | 12.257 |
| 0.7569444444444445 | 12.257 |
| 0.7576388888888889 | 7.887 |
| 0.7583333333333333 | 7.887 |
| 0.7590277777777777 | 7.887 |
| 0.7597222222222223 | 7.887 |
| 0.7604166666666666 | 7.887 |
| 0.7611111111111111 | 7.887 |
| 0.7618055555555556 | 7.887 |
| 0.7625000000000001 | 7.887 |
| 0.7631944444444444 | 7.887 |
| 0.7638888888888888 | 7.887 |
| 0.7645833333333334 | 7.887 |
| 0.7652777777777778 | 7.887 |
| 0.7659722222222222 | 7.887 |
| 0.7666666666666666 | 7.887 |
| 0.7673611111111112 | 7.887 |
| 0.7680555555555556 | 7.887 |
| 0.7687499999999999 | 7.887 |
| 0.7694444444444444 | 7.887 |
| 0.7701388888888889 | 7.887 |
| 0.7708333333333334 | 7.887 |
| 0.7715277777777777 | 7.887 |
| 0.7722222222222223 | 7.887 |
| 0.7729166666666667 | 7.887 |
| 0.7736111111111111 | 7.887 |
| 0.7743055555555555 | 7.887 |
| 0.775 | 7.887 |
| 0.7756944444444445 | 7.887 |
| 0.7763888888888889 | 3.525 |
| 0.7770833333333332 | 3.525 |
| 0.7777777777777778 | 3.525 |
| 0.7784722222222222 | 3.525 |
| 0.7791666666666667 | 3.525 |
| 0.779861111111111 | 3.525 |
| 0.7805555555555556 | 3.525 |
| 0.78125 | 3.525 |
| 0.7819444444444444 | 3.525 |
| 0.782638888888889 | 3.525 |
| 0.7833333333333333 | 3.525 |
| 0.7840277777777778 | 3.525 |
| 0.7847222222222222 | 3.525 |
| 0.7854166666666668 | 3.525 |
| 0.7861111111111111 | 3.525 |
| 0.7868055555555555 | 3.525 |
| 0.7875 | 3.525 |
| 0.7881944444444445 | 3.525 |
| 0.7888888888888889 | 3.525 |
| 0.7895833333333333 | 3.525 |
| 0.7902777777777777 | 7.887 |
| 0.7909722222222223 | 3.525 |
| 0.7916666666666666 | 7.887 |
| 0.7923611111111111 | 7.887 |
| 0.7930555555555556 | 3.525 |
| 0.7937500000000001 | 7.887 |
| 0.7944444444444444 | 7.887 |
| 0.7951388888888888 | 7.887 |
| 0.7958333333333334 | 3.525 |
| 0.7965277777777778 | 3.525 |
| 0.7972222222222222 | 3.525 |
| 0.7979166666666666 | 7.887 |
| 0.7986111111111112 | 7.887 |
| 0.7993055555555556 | 7.887 |
| 0.7999999999999999 | 7.887 |
| 0.8006944444444444 | 7.887 |
| 0.8013888888888889 | 3.525 |
| 0.8020833333333334 | 7.887 |
| 0.8027777777777777 | 3.525 |
| 0.8034722222222223 | 7.887 |
| 0.8041666666666667 | 3.525 |
| 0.8048611111111111 | 3.525 |
| 0.8055555555555555 | 3.525 |
| 0.80625 | 3.525 |
| 0.8069444444444445 | 3.525 |
| 0.8076388888888889 | 3.525 |
| 0.8083333333333332 | 0 |
| 0.8090277777777778 | 0 |
| 0.8097222222222222 | 0 |
| 0.8104166666666667 | 0 |
| 0.811111111111111 | 0 |
| 0.8118055555555556 | 0 |
| 0.8125 | 0 |
| 0.8131944444444444 | 0 |
| 0.813888888888889 | 0 |
| 0.8145833333333333 | 0 |
| 0.8152777777777778 | 0 |
| 0.8159722222222222 | 0 |
| 0.8166666666666668 | 0 |
| 0.8173611111111111 | 0 |
| 0.8180555555555555 | 0 |
| 0.81875 | 0 |
| 0.8194444444444445 | 0 |
| 0.8201388888888889 | 0 |
| 0.8208333333333333 | 0 |
| 0.8215277777777777 | 0 |
| 0.8222222222222223 | 0 |
| 0.8229166666666666 | 0 |
| 0.8236111111111111 | 0 |
| 0.8243055555555556 | 0 |
| 0.8250000000000001 | 0 |
| 0.8256944444444444 | 0 |
| 0.8263888888888888 | 0 |
| 0.8270833333333334 | 0 |
| 0.8277777777777778 | 0 |
| 0.8284722222222222 | 0 |
| 0.8291666666666666 | 0 |
| 0.8298611111111112 | 0 |
| 0.8305555555555556 | 0 |
| 0.8312499999999999 | 0 |
| 0.8319444444444444 | 0 |
| 0.8326388888888889 | 0 |
| 0.8333333333333334 | 0 |
| 0.8340277777777777 | 0 |
| 0.8347222222222223 | 0 |
| 0.8354166666666667 | 0 |
| 0.8361111111111111 | 0 |
| 0.8368055555555555 | 0 |
| 0.8375 | 0 |
| 0.8381944444444445 | 0 |
| 0.8388888888888889 | 0 |
| 0.8395833333333332 | 0 |
| 0.8402777777777778 | 0 |
| 0.8409722222222222 | 0 |
| 0.8416666666666667 | 0 |
| 0.842361111111111 | 0 |
| 0.8430555555555556 | 0 |
| 0.84375 | 0 |
| 0.8444444444444444 | 0 |
| 0.845138888888889 | 0 |
| 0.8458333333333333 | 0 |
| 0.8465277777777778 | 0 |
| 0.8472222222222222 | 0 |
| 0.8479166666666668 | 0 |
| 0.8486111111111111 | 0 |
| 0.8493055555555555 | 0 |
| 0.85 | 0 |
| 0.8506944444444445 | 0 |
| 0.8513888888888889 | 0 |
| 0.8520833333333333 | 0 |
| 0.8527777777777777 | 0 |
| 0.8534722222222223 | 0 |
| 0.8541666666666666 | 0 |
| 0.8548611111111111 | 0 |
| 0.8555555555555556 | 0 |
| 0.8562500000000001 | 0 |
| 0.8569444444444444 | 0 |
| 0.8576388888888888 | 0 |
| 0.8583333333333334 | 0 |
| 0.8590277777777778 | 0 |
| 0.8597222222222222 | 0 |
| 0.8604166666666666 | 0 |
| 0.8611111111111112 | 0 |
| 0.8618055555555556 | 0 |
| 0.8624999999999999 | 0 |
| 0.8631944444444444 | 0 |
| 0.8638888888888889 | 0 |
| 0.8645833333333334 | 0 |
| 0.8652777777777777 | 0 |
| 0.8659722222222223 | 0 |
| 0.8666666666666667 | 0 |
| 0.8673611111111111 | 0 |
| 0.8680555555555555 | 0 |
| 0.86875 | 0 |
| 0.8694444444444445 | 0 |
| 0.8701388888888889 | 0 |
| 0.8708333333333332 | 0 |
| 0.8715277777777778 | 0 |
| 0.8722222222222222 | 0 |
| 0.8729166666666667 | 0 |
| 0.873611111111111 | 0 |
| 0.8743055555555556 | 0 |
| 0.875 | 0 |
| 0.8756944444444444 | 0 |
| 0.876388888888889 | 0 |
| 0.8770833333333333 | 0 |
| 0.8777777777777778 | 0 |
| 0.8784722222222222 | 0 |
| 0.8791666666666668 | 0 |
| 0.8798611111111111 | 0 |
| 0.8805555555555555 | 0 |
| 0.88125 | 0 |
| 0.8819444444444445 | 0 |
| 0.8826388888888889 | 0 |
| 0.8833333333333333 | 0 |
| 0.8840277777777777 | 0 |
| 0.8847222222222223 | 0 |
| 0.8854166666666666 | 0 |
| 0.8861111111111111 | 0 |
| 0.8868055555555556 | 0 |
| 0.8875000000000001 | 0 |
| 0.8881944444444444 | 0 |
| 0.8888888888888888 | 0 |
| 0.8895833333333334 | 0 |
| 0.8902777777777778 | 0 |
| 0.8909722222222222 | 0 |
| 0.8916666666666666 | 0 |
| 0.8923611111111112 | 0 |
| 0.8930555555555556 | 0 |
| 0.8937499999999999 | 0 |
| 0.8944444444444444 | 0 |
| 0.8951388888888889 | 0 |
| 0.8958333333333334 | 0 |
| 0.8965277777777777 | 0 |
| 0.8972222222222223 | 0 |
| 0.8979166666666667 | 0 |
| 0.8986111111111111 | 0 |
| 0.8993055555555555 | 0 |
| 0.9 | 0 |
| 0.9006944444444445 | 0 |
| 0.9013888888888889 | 0 |
| 0.9020833333333332 | 0 |
| 0.9027777777777778 | 0 |
| 0.9034722222222222 | 0 |
| 0.9041666666666667 | 0 |
| 0.904861111111111 | 0 |
| 0.9055555555555556 | 0 |
| 0.90625 | 0 |
| 0.9069444444444444 | 0 |
| 0.907638888888889 | 0 |
| 0.9083333333333333 | 0 |
| 0.9090277777777778 | 0 |
| 0.9097222222222222 | 0 |
| 0.9104166666666668 | 0 |
| 0.9111111111111111 | 0 |
| 0.9118055555555555 | 0 |
| 0.9125 | 0 |
| 0.9131944444444445 | 0 |
| 0.9138888888888889 | 0 |
| 0.9145833333333333 | 0 |
| 0.9152777777777777 | 0 |
| 0.9159722222222223 | 0 |
| 0.9166666666666666 | 0 |
| 0.9173611111111111 | 0 |
| 0.9180555555555556 | 0 |
| 0.9187500000000001 | 0 |
| 0.9194444444444444 | 0 |
| 0.9201388888888888 | 0 |
| 0.9208333333333334 | 0 |
| 0.9215277777777778 | 0 |
| 0.9222222222222222 | 0 |
| 0.9229166666666666 | 0 |
| 0.9236111111111112 | 0 |
| 0.9243055555555556 | 0 |
| 0.9249999999999999 | 0 |
| 0.9256944444444444 | 0 |
| 0.9263888888888889 | 0 |
| 0.9270833333333334 | 0 |
| 0.9277777777777777 | 0 |
| 0.9284722222222223 | 0 |
| 0.9291666666666667 | 0 |
| 0.9298611111111111 | 0 |
| 0.9305555555555555 | 0 |
| 0.93125 | 0 |
| 0.9319444444444445 | 0 |
| 0.9326388888888889 | 0 |
| 0.9333333333333332 | 0 |
| 0.9340277777777778 | 0 |
| 0.9347222222222222 | 0 |
| 0.9354166666666667 | 0 |
| 0.936111111111111 | 0 |
| 0.9368055555555556 | 0 |
| 0.9375 | 0 |
| 0.9381944444444444 | 0 |
| 0.938888888888889 | 0 |
| 0.9395833333333333 | 0 |
| 0.9402777777777778 | 0 |
| 0.9409722222222222 | 0 |
| 0.9416666666666668 | 0 |
| 0.9423611111111111 | 0 |
| 0.9430555555555555 | 0 |
| 0.94375 | 0 |
| 0.9444444444444445 | 0 |
| 0.9451388888888889 | 0 |
| 0.9458333333333333 | 0 |
| 0.9465277777777777 | 0 |
| 0.9472222222222223 | 0 |
| 0.9479166666666666 | 0 |
| 0.9486111111111111 | 0 |
| 0.9493055555555556 | 0 |
| 0.9500000000000001 | 0 |
| 0.9506944444444444 | 0 |
| 0.9513888888888888 | 0 |
| 0.9520833333333334 | 0 |
| 0.9527777777777778 | 0 |
| 0.9534722222222222 | 0 |
| 0.9541666666666666 | 0 |
| 0.9548611111111112 | 0 |
| 0.9555555555555556 | 0 |
| 0.9562499999999999 | 0 |
| 0.9569444444444444 | 0 |
| 0.9576388888888889 | 0 |
| 0.9583333333333334 | 0 |
| 0.9590277777777777 | 0 |
| 0.9597222222222223 | 0 |
| 0.9604166666666667 | 0 |
| 0.9611111111111111 | 0 |
| 0.9618055555555555 | 0 |
| 0.9625 | 0 |
| 0.9631944444444445 | 0 |
| 0.9638888888888889 | 0 |
| 0.9645833333333332 | 0 |
| 0.9652777777777778 | 0 |
| 0.9659722222222222 | 0 |
| 0.9666666666666667 | 0 |
| 0.967361111111111 | 0 |
| 0.9680555555555556 | 0 |
| 0.96875 | 0 |
| 0.9694444444444444 | 0 |
| 0.970138888888889 | 0 |
| 0.9708333333333333 | 0 |
| 0.9715277777777778 | 0 |
| 0.9722222222222222 | 0 |
| 0.9729166666666668 | 0 |
| 0.9736111111111111 | 0 |
| 0.9743055555555555 | 0 |
| 0.975 | 0 |
| 0.9756944444444445 | 0 |
| 0.9763888888888889 | 0 |
| 0.9770833333333333 | 0 |
| 0.9777777777777777 | 0 |
| 0.9784722222222223 | 0 |
| 0.9791666666666666 | 0 |
| 0.9798611111111111 | 0 |
| 0.9805555555555556 | 0 |
| 0.9812500000000001 | 0 |
| 0.9819444444444444 | 0 |
| 0.9826388888888888 | 0 |
| 0.9833333333333334 | 0 |
| 0.9840277777777778 | 0 |
| 0.9847222222222222 | 0 |
| 0.9854166666666666 | 0 |
| 0.9861111111111112 | 0 |
| 0.9868055555555556 | 0 |
| 0.9874999999999999 | 0 |
| 0.9881944444444444 | 0 |
| 0.9888888888888889 | 0 |
| 0.9895833333333334 | 0 |
| 0.9902777777777777 | 0 |
| 0.9909722222222223 | 0 |
| 0.9916666666666667 | 0 |
| 0.9923611111111111 | 0 |
| 0.9930555555555555 | 0 |
| 0.99375 | 0 |
| 0.9944444444444445 | 0 |
| 0.9951388888888889 | 0 |
| 0.9958333333333332 | 0 |
| 0.9965277777777778 | 0 |
| 0.9972222222222222 | 0 |
| 0.9979166666666667 | 0 |
| 0.998611111111111 | 0 |
| 0.9993055555555556 | 0 |